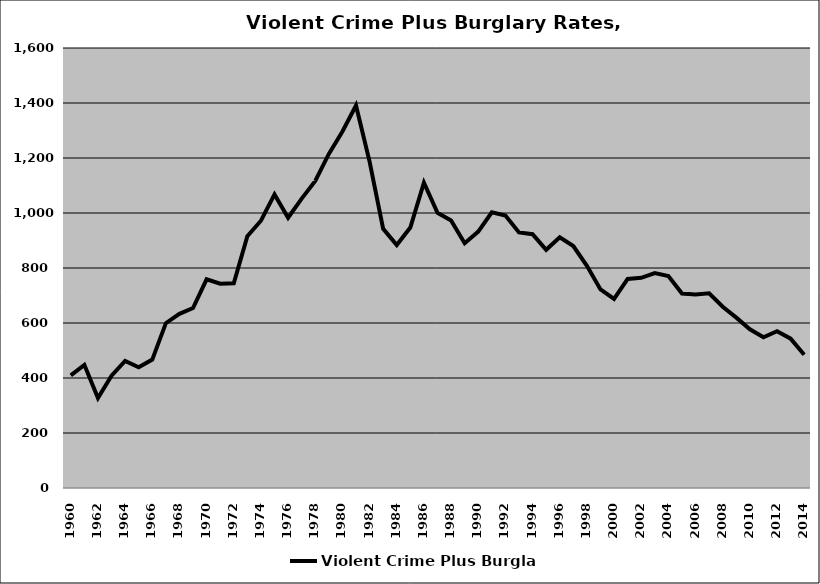
| Category | Violent Crime Plus Burglary |
|---|---|
| 1960.0 | 409.615 |
| 1961.0 | 447.929 |
| 1962.0 | 327.123 |
| 1963.0 | 408.309 |
| 1964.0 | 462.391 |
| 1965.0 | 438.824 |
| 1966.0 | 466.869 |
| 1967.0 | 599.365 |
| 1968.0 | 633.333 |
| 1969.0 | 654.375 |
| 1970.0 | 758.989 |
| 1971.0 | 742.647 |
| 1972.0 | 744.348 |
| 1973.0 | 915.864 |
| 1974.0 | 971.866 |
| 1975.0 | 1067.647 |
| 1976.0 | 982.821 |
| 1977.0 | 1052.463 |
| 1978.0 | 1116.509 |
| 1979.0 | 1214.667 |
| 1980.0 | 1296.289 |
| 1981.0 | 1391.057 |
| 1982.0 | 1187.052 |
| 1983.0 | 942.607 |
| 1984.0 | 883.757 |
| 1985.0 | 947.348 |
| 1986.0 | 1110.454 |
| 1987.0 | 1000.612 |
| 1988.0 | 972.824 |
| 1989.0 | 890.105 |
| 1990.0 | 932.344 |
| 1991.0 | 1002.391 |
| 1992.0 | 990.558 |
| 1993.0 | 929.362 |
| 1994.0 | 923.109 |
| 1995.0 | 866.25 |
| 1996.0 | 911.642 |
| 1997.0 | 879.792 |
| 1998.0 | 808.108 |
| 1999.0 | 722.266 |
| 2000.0 | 687.348 |
| 2001.0 | 760.095 |
| 2002.0 | 764.188 |
| 2003.0 | 781.7 |
| 2004.0 | 771.121 |
| 2005.0 | 707.157 |
| 2006.0 | 704.072 |
| 2007.0 | 708.07 |
| 2008.0 | 658.935 |
| 2009.0 | 619.545 |
| 2010.0 | 577.156 |
| 2011.0 | 547.98 |
| 2012.0 | 569.867 |
| 2013.0 | 543.188 |
| 2014.0 | 484.633 |